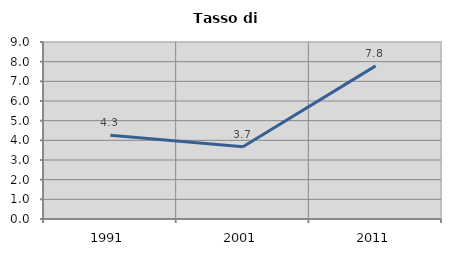
| Category | Tasso di disoccupazione   |
|---|---|
| 1991.0 | 4.255 |
| 2001.0 | 3.676 |
| 2011.0 | 7.787 |